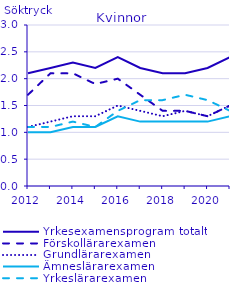
| Category | Yrkesexamensprogram totalt | Förskollärarexamen                                 | Grundlärarexamen                                   | Ämneslärarexamen                                   | Yrkeslärarexamen                                   |
|---|---|---|---|---|---|
| 2012.0 | 2.1 | 1.7 | 1.1 | 1 | 1.1 |
| 2013.0 | 2.2 | 2.1 | 1.2 | 1 | 1.1 |
| 2014.0 | 2.3 | 2.1 | 1.3 | 1.1 | 1.2 |
| 2015.0 | 2.2 | 1.9 | 1.3 | 1.1 | 1.1 |
| 2016.0 | 2.4 | 2 | 1.5 | 1.3 | 1.4 |
| 2017.0 | 2.2 | 1.7 | 1.4 | 1.2 | 1.6 |
| 2018.0 | 2.1 | 1.4 | 1.3 | 1.2 | 1.6 |
| 2019.0 | 2.1 | 1.4 | 1.4 | 1.2 | 1.7 |
| 2020.0 | 2.2 | 1.3 | 1.3 | 1.2 | 1.6 |
| 2021.0 | 2.4 | 1.5 | 1.5 | 1.3 | 1.4 |